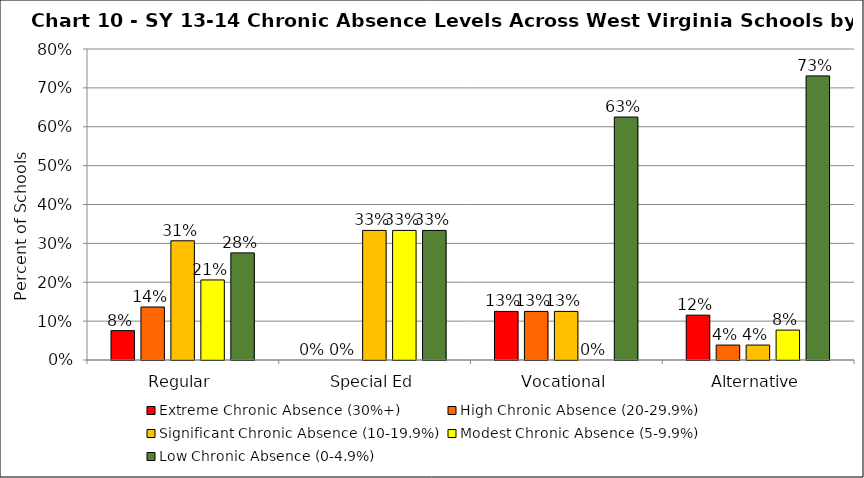
| Category | Extreme Chronic Absence (30%+) | High Chronic Absence (20-29.9%) | Significant Chronic Absence (10-19.9%) | Modest Chronic Absence (5-9.9%) | Low Chronic Absence (0-4.9%) |
|---|---|---|---|---|---|
| 0 | 0.076 | 0.136 | 0.307 | 0.206 | 0.276 |
| 1 | 0 | 0 | 0.333 | 0.333 | 0.333 |
| 2 | 0.125 | 0.125 | 0.125 | 0 | 0.625 |
| 3 | 0.115 | 0.038 | 0.038 | 0.077 | 0.731 |